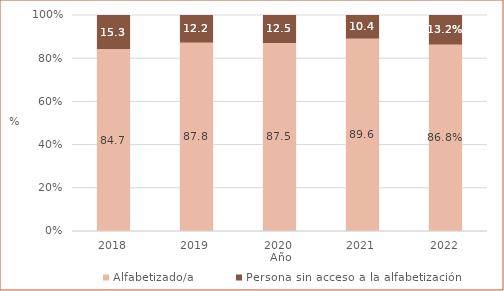
| Category | Alfabetizado/a | Persona sin acceso a la alfabetización |
|---|---|---|
| 2018.0 | 84.696 | 15.304 |
| 2019.0 | 87.758 | 12.242 |
| 2020.0 | 87.521 | 12.479 |
| 2021.0 | 89.6 | 10.4 |
| 2022.0 | 0.868 | 0.132 |